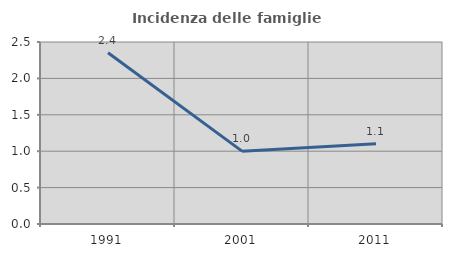
| Category | Incidenza delle famiglie numerose |
|---|---|
| 1991.0 | 2.353 |
| 2001.0 | 1.001 |
| 2011.0 | 1.102 |